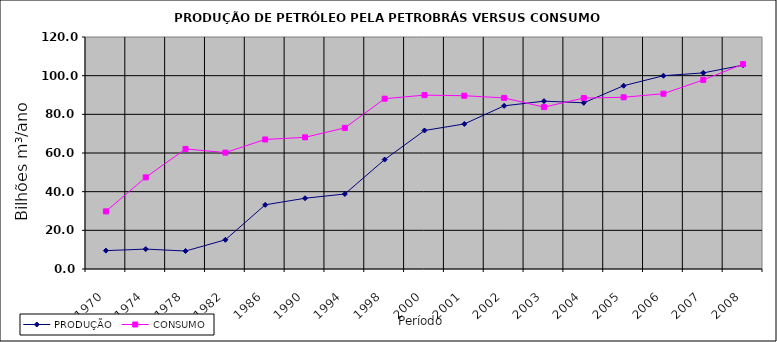
| Category | PRODUÇÃO | CONSUMO |
|---|---|---|
| 1970.0 | 9.5 | 29.8 |
| 1974.0 | 10.3 | 47.4 |
| 1978.0 | 9.3 | 62.1 |
| 1982.0 | 15.1 | 60.2 |
| 1986.0 | 33.2 | 67 |
| 1990.0 | 36.6 | 68.1 |
| 1994.0 | 38.8 | 73 |
| 1998.0 | 56.6 | 88.1 |
| 2000.0 | 71.644 | 89.93 |
| 2001.0 | 75.02 | 89.625 |
| 2002.0 | 84.399 | 88.497 |
| 2003.0 | 86.82 | 83.734 |
| 2004.0 | 85.967 | 88.42 |
| 2005.0 | 94.797 | 88.807 |
| 2006.0 | 99.971 | 90.673 |
| 2007.0 | 101.437 | 97.786 |
| 2008.0 | 105.452 | 105.973 |